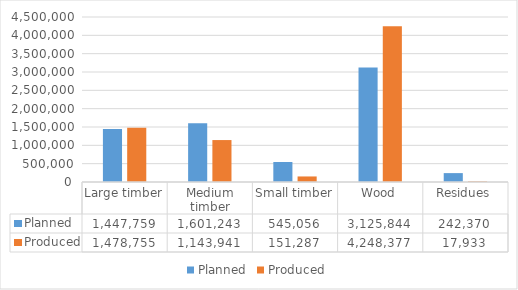
| Category | Planned | Produced |
|---|---|---|
| Large timber | 1447759 | 1478755 |
| Medium timber | 1601243 | 1143941 |
| Small timber | 545056 | 151287 |
| Wood | 3125844 | 4248377 |
| Residues | 242370 | 17933 |